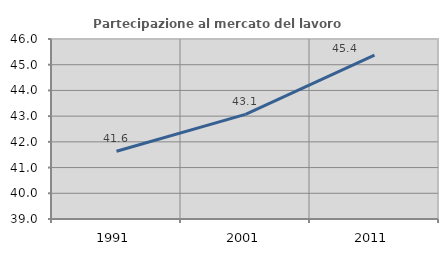
| Category | Partecipazione al mercato del lavoro  femminile |
|---|---|
| 1991.0 | 41.636 |
| 2001.0 | 43.07 |
| 2011.0 | 45.371 |